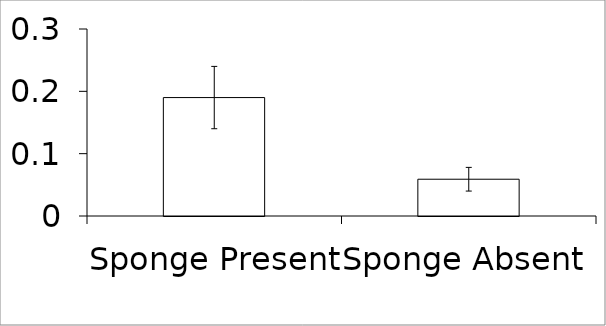
| Category | Series 0 |
|---|---|
| Sponge Present | 0.19 |
| Sponge Absent | 0.059 |